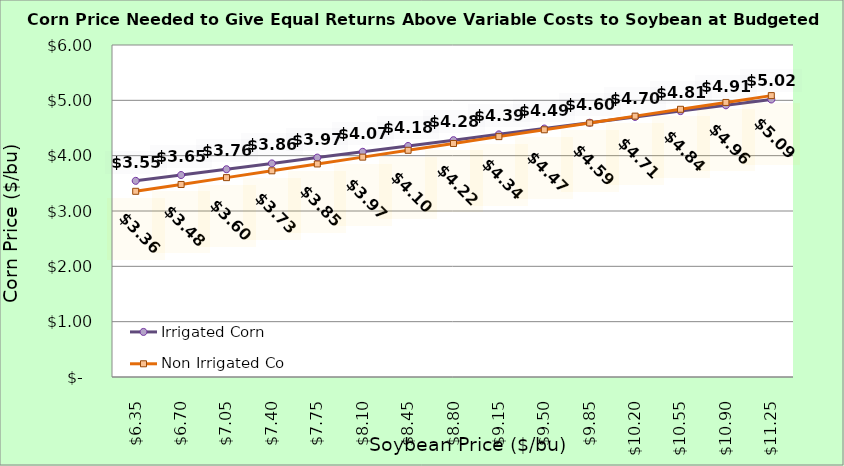
| Category | Irrigated Corn | Non Irrigated Corn |
|---|---|---|
| 6.350000000000003 | 3.545 | 3.356 |
| 6.700000000000003 | 3.65 | 3.479 |
| 7.0500000000000025 | 3.755 | 3.603 |
| 7.400000000000002 | 3.86 | 3.727 |
| 7.750000000000002 | 3.965 | 3.85 |
| 8.100000000000001 | 4.07 | 3.974 |
| 8.450000000000001 | 4.175 | 4.097 |
| 8.8 | 4.28 | 4.221 |
| 9.15 | 4.385 | 4.344 |
| 9.5 | 4.49 | 4.468 |
| 9.85 | 4.595 | 4.591 |
| 10.2 | 4.7 | 4.715 |
| 10.549999999999999 | 4.805 | 4.838 |
| 10.899999999999999 | 4.91 | 4.962 |
| 11.249999999999998 | 5.015 | 5.085 |